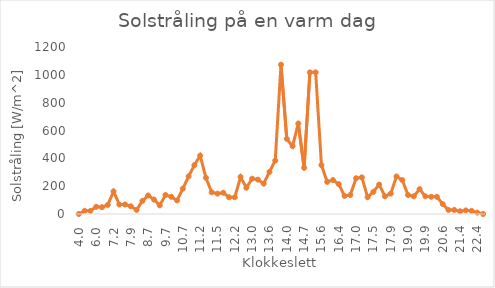
| Category | Series 1 |
|---|---|
| 4.0 | 0 |
| 5.0775 | 22.764 |
| 5.50851 | 22.764 |
| 6.01134 | 52.033 |
| 6.33459 | 48.78 |
| 6.62193 | 65.041 |
| 7.16068 | 162.602 |
| 7.37618 | 68.293 |
| 7.69943 | 68.293 |
| 7.87902 | 55.285 |
| 8.09452 | 29.268 |
| 8.52552 | 94.309 |
| 8.7051 | 133.333 |
| 9.17202 | 104.065 |
| 9.35161 | 61.789 |
| 9.67486 | 136.585 |
| 9.85444 | 123.577 |
| 10.03403 | 97.561 |
| 10.68053 | 182.114 |
| 10.8242 | 269.919 |
| 11.0397 | 351.22 |
| 11.18336 | 419.512 |
| 11.29112 | 260.163 |
| 11.32703 | 156.098 |
| 11.54253 | 146.341 |
| 11.82987 | 152.846 |
| 12.00945 | 120.325 |
| 12.15312 | 120.325 |
| 12.69187 | 266.667 |
| 12.83554 | 188.618 |
| 13.01512 | 253.659 |
| 13.19471 | 247.154 |
| 13.33837 | 217.886 |
| 13.55388 | 302.439 |
| 13.58979 | 383.74 |
| 13.84121 | 1073.171 |
| 14.02079 | 539.837 |
| 14.16446 | 487.805 |
| 14.34405 | 650.406 |
| 14.6673 | 331.707 |
| 15.02647 | 1017.886 |
| 15.17013 | 1017.886 |
| 15.56522 | 351.22 |
| 15.85255 | 230.894 |
| 16.03214 | 243.902 |
| 16.35539 | 214.634 |
| 16.53497 | 130.081 |
| 16.71456 | 136.585 |
| 17.00189 | 256.911 |
| 17.21739 | 263.415 |
| 17.36106 | 120.325 |
| 17.54064 | 159.35 |
| 17.68431 | 211.382 |
| 18.15123 | 126.829 |
| 17.93573 | 146.341 |
| 18.68998 | 269.919 |
| 18.86957 | 243.902 |
| 19.01323 | 136.585 |
| 19.33648 | 126.829 |
| 19.51607 | 178.862 |
| 19.87524 | 126.829 |
| 20.16257 | 123.577 |
| 20.37807 | 123.577 |
| 20.59357 | 71.545 |
| 21.02457 | 29.268 |
| 21.20416 | 29.268 |
| 21.38374 | 19.512 |
| 21.81474 | 26.016 |
| 22.20983 | 22.764 |
| 22.38941 | 9.756 |
| 23.03592 | 0 |